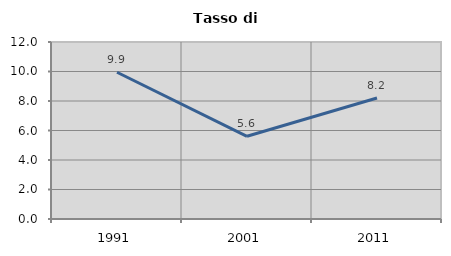
| Category | Tasso di disoccupazione   |
|---|---|
| 1991.0 | 9.948 |
| 2001.0 | 5.607 |
| 2011.0 | 8.202 |